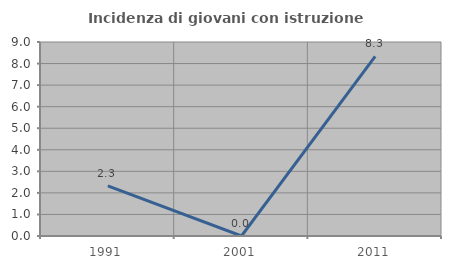
| Category | Incidenza di giovani con istruzione universitaria |
|---|---|
| 1991.0 | 2.326 |
| 2001.0 | 0 |
| 2011.0 | 8.333 |